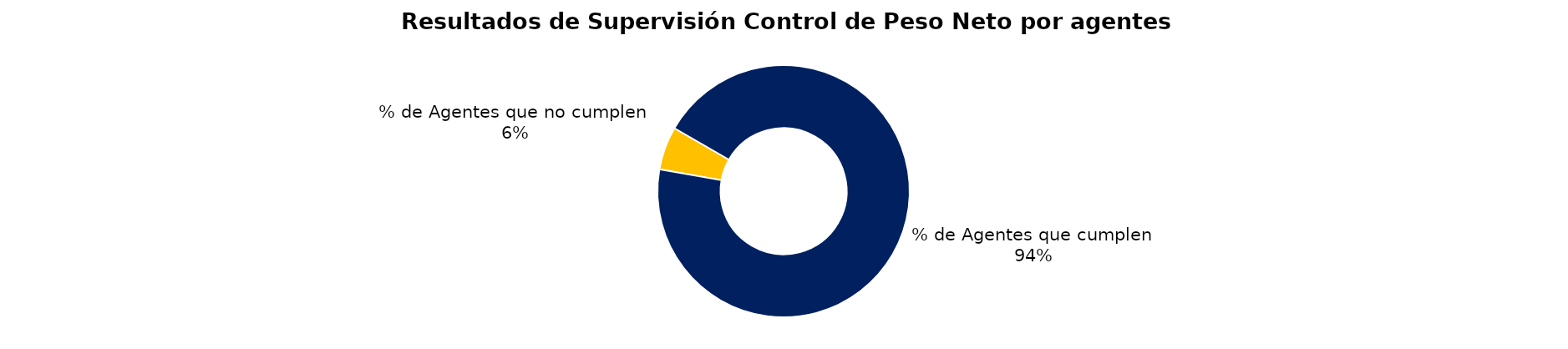
| Category | Series 0 |
|---|---|
| % de Agentes que no cumplen | 1 |
| % de Agentes que cumplen | 17 |